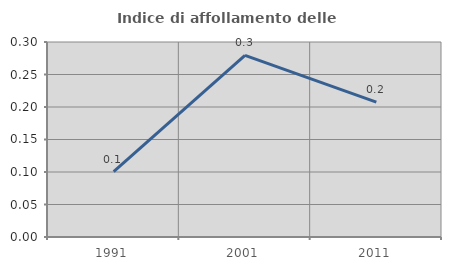
| Category | Indice di affollamento delle abitazioni  |
|---|---|
| 1991.0 | 0.101 |
| 2001.0 | 0.28 |
| 2011.0 | 0.208 |